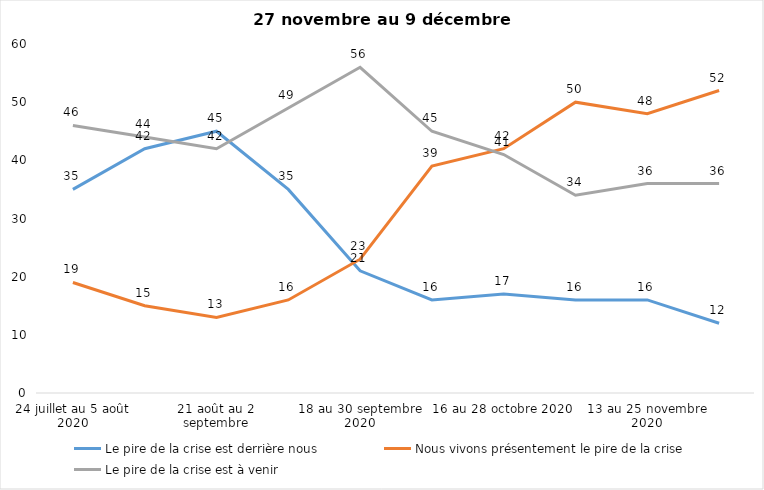
| Category | Le pire de la crise est derrière nous | Nous vivons présentement le pire de la crise | Le pire de la crise est à venir |
|---|---|---|---|
| 24 juillet au 5 août 2020 | 35 | 19 | 46 |
| 7 au 19 août 2020 | 42 | 15 | 44 |
| 21 août au 2 septembre | 45 | 13 | 42 |
| 4 au 16 septembre 2020 | 35 | 16 | 49 |
| 18 au 30 septembre 2020 | 21 | 23 | 56 |
| 2 au 14 octobre 2020 | 16 | 39 | 45 |
| 16 au 28 octobre 2020 | 17 | 42 | 41 |
| 30 octobre au 11 novembre 2020 | 16 | 50 | 34 |
| 13 au 25 novembre 2020 | 16 | 48 | 36 |
| 27 au 9 décembre 2020 | 12 | 52 | 36 |